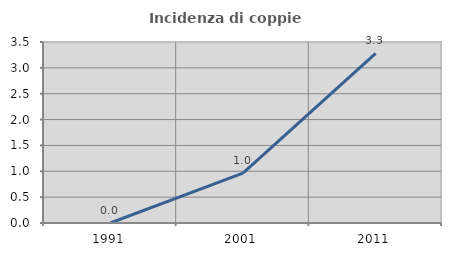
| Category | Incidenza di coppie miste |
|---|---|
| 1991.0 | 0 |
| 2001.0 | 0.964 |
| 2011.0 | 3.279 |